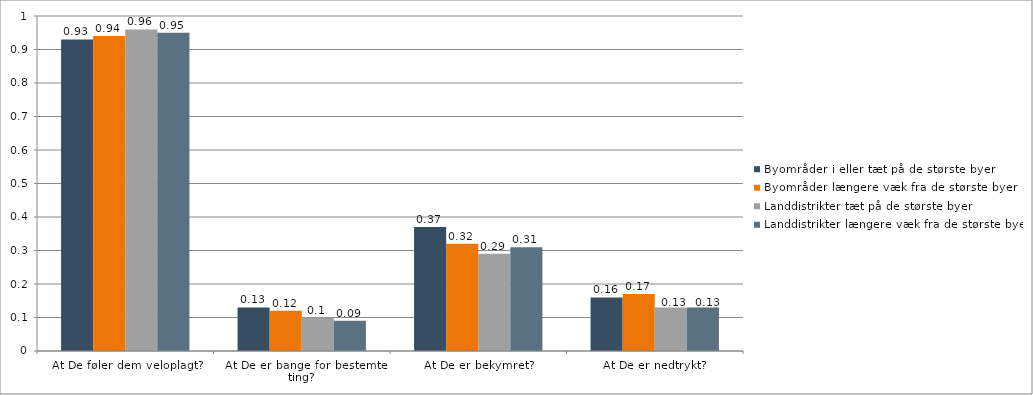
| Category | Byområder i eller tæt på de største byer | Byområder længere væk fra de største byer | Landdistrikter tæt på de største byer | Landdistrikter længere væk fra de største byer |
|---|---|---|---|---|
| At De føler dem veloplagt? | 0.93 | 0.94 | 0.96 | 0.95 |
| At De er bange for bestemte ting? | 0.13 | 0.12 | 0.1 | 0.09 |
| At De er bekymret? | 0.37 | 0.32 | 0.29 | 0.31 |
| At De er nedtrykt? | 0.16 | 0.17 | 0.13 | 0.13 |